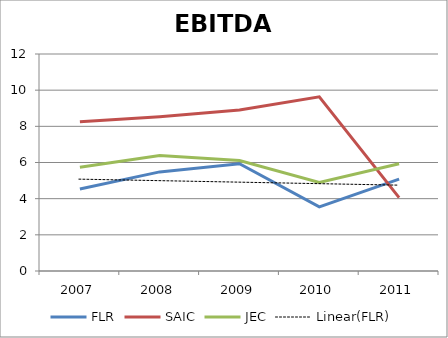
| Category | FLR | SAIC | JEC |
|---|---|---|---|
| 2007.0 | 4.53 | 8.25 | 5.74 |
| 2008.0 | 5.48 | 8.53 | 6.39 |
| 2009.0 | 5.93 | 8.9 | 6.11 |
| 2010.0 | 3.55 | 9.63 | 4.9 |
| 2011.0 | 5.08 | 4.06 | 5.93 |